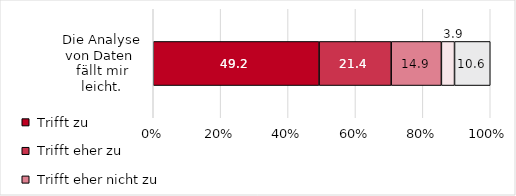
| Category | Series 0 | Series 1 | Series 2 | Series 3 | Series 4 |
|---|---|---|---|---|---|
| Die Analyse von Daten 
fällt mir leicht. | 49.2 | 21.4 | 14.9 | 3.9 | 10.6 |